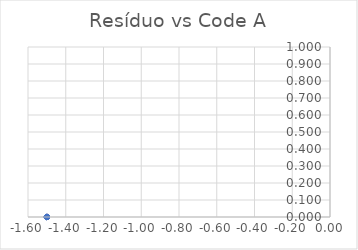
| Category | Series 0 |
|---|---|
| -1.5 | 0 |
| -1.5 | 0 |
| -1.5 | 0 |
| -1.5 | 0 |
| -1.5 | 0 |
| -1.5 | 0 |
| -1.5 | 0 |
| -1.5 | 0 |
| -1.5 | 0 |
| -1.5 | 0 |
| -1.5 | 0 |
| -1.5 | 0 |
| -1.5 | 0 |
| -1.5 | 0 |
| -1.5 | 0 |
| -1.5 | 0 |
| -1.5 | 0 |
| -1.5 | 0 |
| -1.5 | 0 |
| -1.5 | 0 |
| -1.5 | 0 |
| -1.5 | 0 |
| -1.5 | 0 |
| -1.5 | 0 |
| -1.5 | 0 |
| -1.5 | 0 |
| -1.5 | 0 |
| -1.5 | 0 |
| -1.5 | 0 |
| -1.5 | 0 |
| -1.5 | 0 |
| -1.5 | 0 |
| -1.5 | 0 |
| -1.5 | 0 |
| -1.5 | 0 |
| -1.5 | 0 |
| -1.5 | 0 |
| -1.5 | 0 |
| -1.5 | 0 |
| -1.5 | 0 |
| -1.5 | 0 |
| -1.5 | 0 |
| -1.5 | 0 |
| -1.5 | 0 |
| -1.5 | 0 |
| -1.5 | 0 |
| -1.5 | 0 |
| -1.5 | 0 |
| -1.5 | 0 |
| -1.5 | 0 |
| -1.5 | 0 |
| -1.5 | 0 |
| -1.5 | 0 |
| -1.5 | 0 |
| -1.5 | 0 |
| -1.5 | 0 |
| -1.5 | 0 |
| -1.5 | 0 |
| -1.5 | 0 |
| -1.5 | 0 |
| -1.5 | 0 |
| -1.5 | 0 |
| -1.5 | 0 |
| -1.5 | 0 |
| -1.5 | 0 |
| -1.5 | 0 |
| -1.5 | 0 |
| -1.5 | 0 |